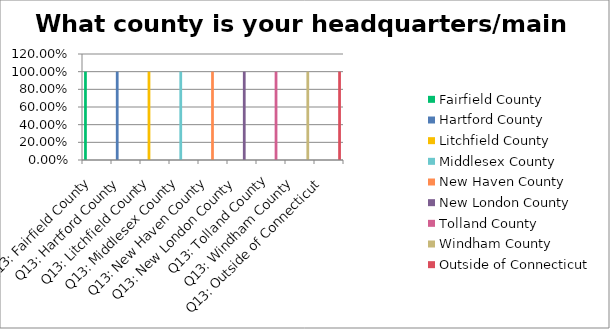
| Category | Fairfield County | Hartford County | Litchfield County | Middlesex County | New Haven County | New London County | Tolland County | Windham County | Outside of Connecticut |
|---|---|---|---|---|---|---|---|---|---|
| Q13: Fairfield County | 1 | 0 | 0 | 0 | 0 | 0 | 0 | 0 | 0 |
| Q13: Hartford County | 0 | 1 | 0 | 0 | 0 | 0 | 0 | 0 | 0 |
| Q13: Litchfield County | 0 | 0 | 1 | 0 | 0 | 0 | 0 | 0 | 0 |
| Q13: Middlesex County | 0 | 0 | 0 | 1 | 0 | 0 | 0 | 0 | 0 |
| Q13: New Haven County | 0 | 0 | 0 | 0 | 1 | 0 | 0 | 0 | 0 |
| Q13: New London County | 0 | 0 | 0 | 0 | 0 | 1 | 0 | 0 | 0 |
| Q13: Tolland County | 0 | 0 | 0 | 0 | 0 | 0 | 1 | 0 | 0 |
| Q13: Windham County | 0 | 0 | 0 | 0 | 0 | 0 | 0 | 1 | 0 |
| Q13: Outside of Connecticut | 0 | 0 | 0 | 0 | 0 | 0 | 0 | 0 | 1 |